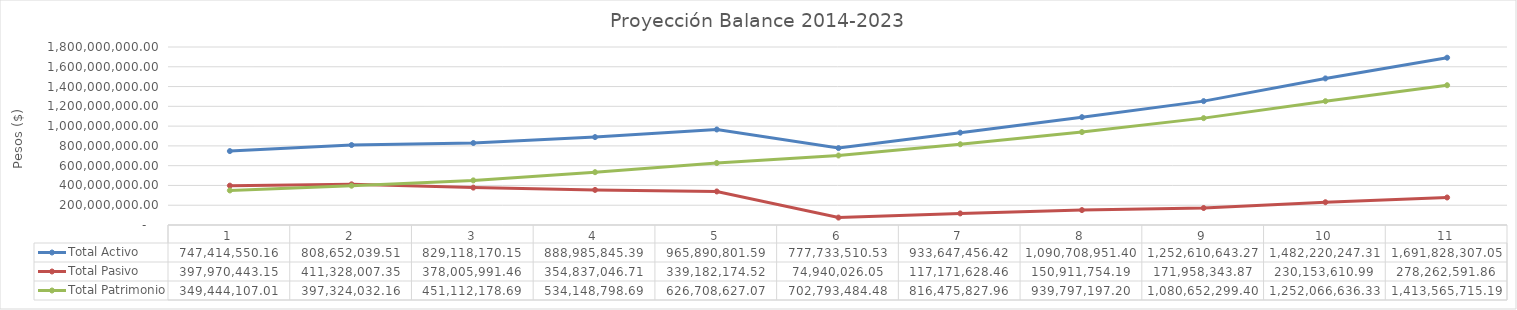
| Category | Total Activo | Total Pasivo | Total Patrimonio |
|---|---|---|---|
| 0 | 747414550.16 | 397970443.15 | 349444107.01 |
| 1 | 808652039.514 | 411328007.353 | 397324032.161 |
| 2 | 829118170.146 | 378005991.456 | 451112178.69 |
| 3 | 888985845.394 | 354837046.705 | 534148798.689 |
| 4 | 965890801.586 | 339182174.52 | 626708627.066 |
| 5 | 777733510.526 | 74940026.051 | 702793484.475 |
| 6 | 933647456.418 | 117171628.458 | 816475827.959 |
| 7 | 1090708951.399 | 150911754.194 | 939797197.204 |
| 8 | 1252610643.266 | 171958343.865 | 1080652299.401 |
| 9 | 1482220247.314 | 230153610.987 | 1252066636.327 |
| 10 | 1691828307.048 | 278262591.859 | 1413565715.189 |